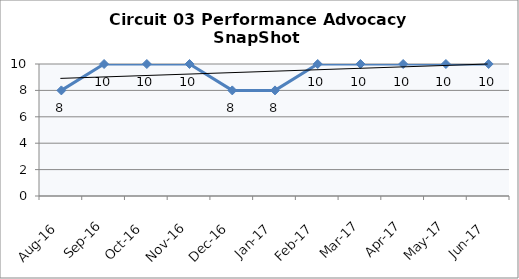
| Category | Circuit 03 |
|---|---|
| Aug-16 | 8 |
| Sep-16 | 10 |
| Oct-16 | 10 |
| Nov-16 | 10 |
| Dec-16 | 8 |
| Jan-17 | 8 |
| Feb-17 | 10 |
| Mar-17 | 10 |
| Apr-17 | 10 |
| May-17 | 10 |
| Jun-17 | 10 |